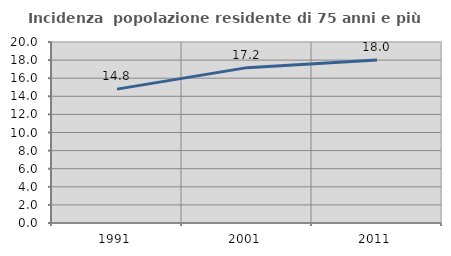
| Category | Incidenza  popolazione residente di 75 anni e più |
|---|---|
| 1991.0 | 14.794 |
| 2001.0 | 17.167 |
| 2011.0 | 18.024 |